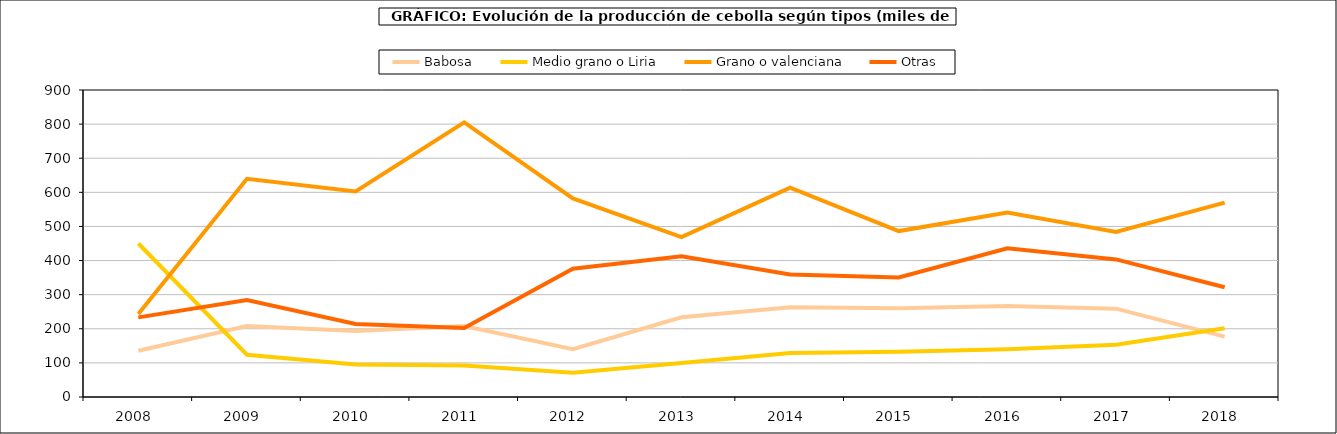
| Category | Babosa | Medio grano o Liria | Grano o valenciana | Otras |
|---|---|---|---|---|
| 2008.0 | 135.75 | 449.968 | 243.373 | 233.447 |
| 2009.0 | 208.229 | 123.904 | 639.656 | 284.499 |
| 2010.0 | 193.415 | 95.014 | 602.708 | 213.99 |
| 2011.0 | 207.933 | 92.32 | 804.939 | 202.339 |
| 2012.0 | 140.272 | 70.819 | 582.337 | 376.293 |
| 2013.0 | 233.875 | 99.562 | 468.759 | 412.305 |
| 2014.0 | 263.155 | 128.911 | 613.774 | 358.887 |
| 2015.0 | 260.238 | 132.601 | 486.456 | 350.547 |
| 2016.0 | 267.04 | 140.214 | 541.052 | 435.792 |
| 2017.0 | 258.956 | 153.086 | 484.161 | 403.331 |
| 2018.0 | 177.049 | 201.455 | 569.731 | 321.921 |